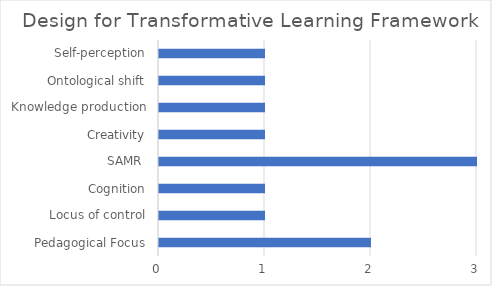
| Category | Transformative Design Score |
|---|---|
| Pedagogical Focus | 2 |
| Locus of control | 1 |
| Cognition | 1 |
| SAMR  | 3 |
| Creativity | 1 |
| Knowledge production | 1 |
| Ontological shift | 1 |
| Self-perception | 1 |